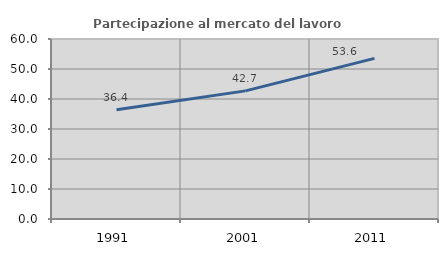
| Category | Partecipazione al mercato del lavoro  femminile |
|---|---|
| 1991.0 | 36.449 |
| 2001.0 | 42.708 |
| 2011.0 | 53.553 |